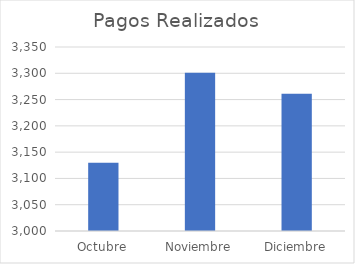
| Category | Pagos Realizados |
|---|---|
| Octubre | 3130 |
| Noviembre | 3301 |
| Diciembre | 3261 |